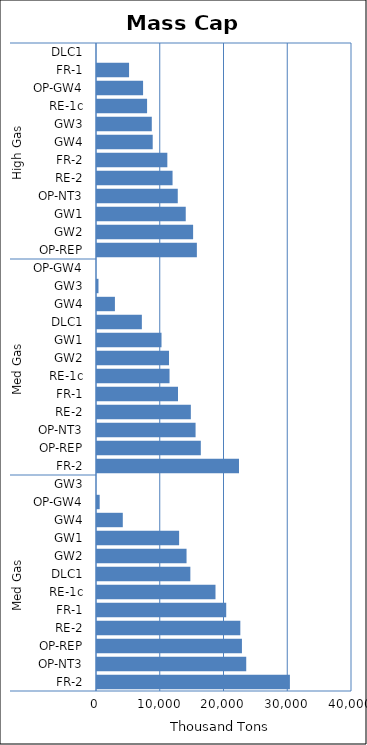
| Category | Mass Cap A |
|---|---|
| 0 | 30258.83 |
| 1 | 23408.93 |
| 2 | 22734.98 |
| 3 | 22482.98 |
| 4 | 20269.85 |
| 5 | 18587.56 |
| 6 | 14643.69 |
| 7 | 14047.18 |
| 8 | 12880.7 |
| 9 | 4046.55 |
| 10 | 420.49 |
| 11 | 0 |
| 12 | 22273.46 |
| 13 | 16284.46 |
| 14 | 15462.61 |
| 15 | 14720.58 |
| 16 | 12706.26 |
| 17 | 11377.7 |
| 18 | 11296.9 |
| 19 | 10119.73 |
| 20 | 7037.23 |
| 21 | 2810.77 |
| 22 | 231.99 |
| 23 | 0 |
| 24 | 15666.46 |
| 25 | 15076.03 |
| 26 | 13920.78 |
| 27 | 12668.58 |
| 28 | 11852 |
| 29 | 11032.75 |
| 30 | 8738.44 |
| 31 | 8595.3 |
| 32 | 7855.46 |
| 33 | 7227.76 |
| 34 | 5029.3 |
| 35 | 0 |